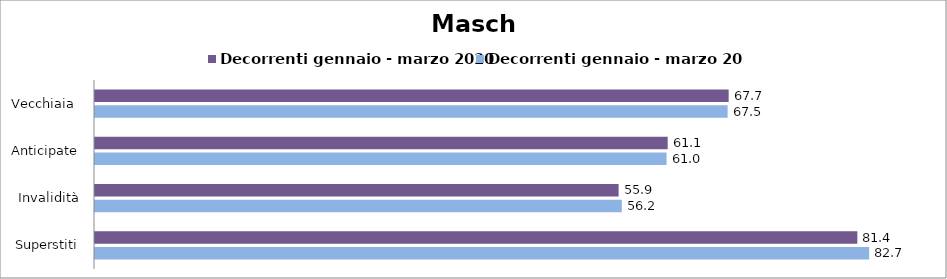
| Category | Decorrenti gennaio - marzo 2020 | Decorrenti gennaio - marzo 2021 |
|---|---|---|
| Vecchiaia  | 67.65 | 67.54 |
| Anticipate | 61.14 | 61.02 |
| Invalidità | 55.9 | 56.24 |
| Superstiti | 81.39 | 82.65 |